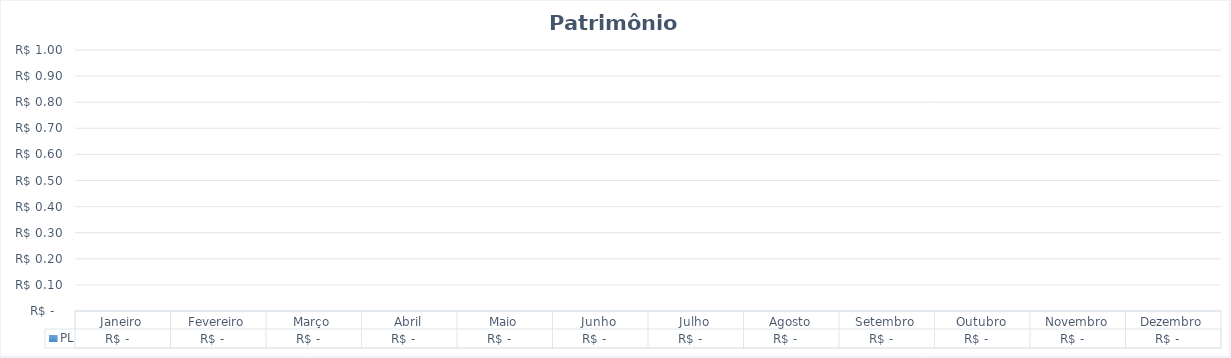
| Category | PL |
|---|---|
| Janeiro | 0 |
| Fevereiro | 0 |
| Março | 0 |
| Abril | 0 |
| Maio | 0 |
| Junho | 0 |
| Julho | 0 |
| Agosto | 0 |
| Setembro | 0 |
| Outubro | 0 |
| Novembro | 0 |
| Dezembro | 0 |